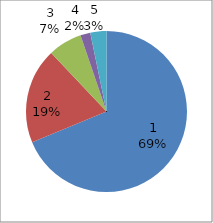
| Category | Series 0 |
|---|---|
| 0 | 1615 |
| 1 | 451 |
| 2 | 160 |
| 3 | 47 |
| 4 | 76 |